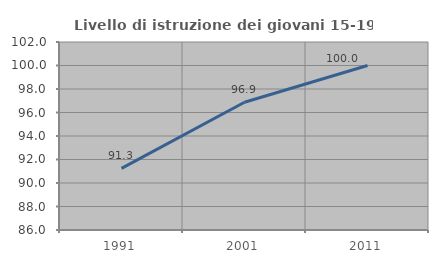
| Category | Livello di istruzione dei giovani 15-19 anni |
|---|---|
| 1991.0 | 91.25 |
| 2001.0 | 96.875 |
| 2011.0 | 100 |